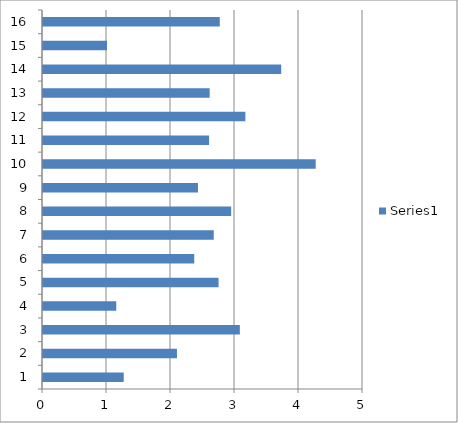
| Category | Series 0 |
|---|---|
| 0 | 1.262 |
| 1 | 2.093 |
| 2 | 3.076 |
| 3 | 1.145 |
| 4 | 2.743 |
| 5 | 2.363 |
| 6 | 2.668 |
| 7 | 2.94 |
| 8 | 2.421 |
| 9 | 4.261 |
| 10 | 2.595 |
| 11 | 3.162 |
| 12 | 2.604 |
| 13 | 3.722 |
| 14 | 1 |
| 15 | 2.762 |